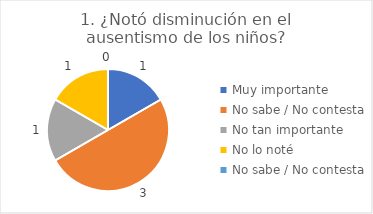
| Category | 1. ¿Notó disminución en el ausentismo de los niños? |
|---|---|
| Muy importante  | 0.167 |
| No sabe / No contesta | 0.5 |
| No tan importante  | 0.167 |
| No lo noté  | 0.167 |
| No sabe / No contesta | 0 |